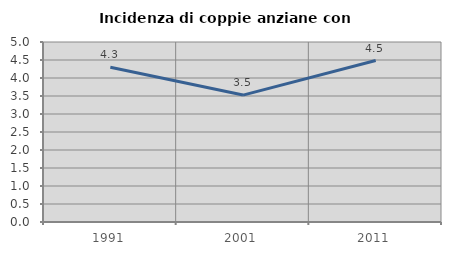
| Category | Incidenza di coppie anziane con figli |
|---|---|
| 1991.0 | 4.301 |
| 2001.0 | 3.526 |
| 2011.0 | 4.485 |